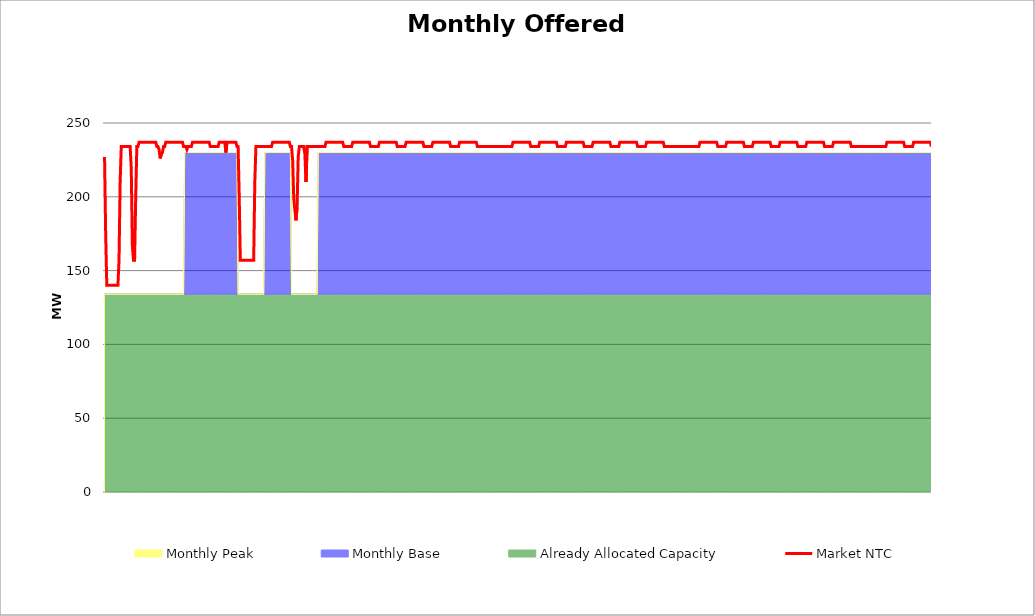
| Category | Market NTC |
|---|---|
| 0 | 227 |
| 1 | 175 |
| 2 | 140 |
| 3 | 140 |
| 4 | 140 |
| 5 | 140 |
| 6 | 140 |
| 7 | 140 |
| 8 | 140 |
| 9 | 140 |
| 10 | 140 |
| 11 | 140 |
| 12 | 140 |
| 13 | 157 |
| 14 | 210 |
| 15 | 234 |
| 16 | 234 |
| 17 | 234 |
| 18 | 234 |
| 19 | 234 |
| 20 | 234 |
| 21 | 234 |
| 22 | 234 |
| 23 | 234 |
| 24 | 219 |
| 25 | 167 |
| 26 | 157 |
| 27 | 157 |
| 28 | 200 |
| 29 | 234 |
| 30 | 234 |
| 31 | 237 |
| 32 | 237 |
| 33 | 237 |
| 34 | 237 |
| 35 | 237 |
| 36 | 237 |
| 37 | 237 |
| 38 | 237 |
| 39 | 237 |
| 40 | 237 |
| 41 | 237 |
| 42 | 237 |
| 43 | 237 |
| 44 | 237 |
| 45 | 237 |
| 46 | 237 |
| 47 | 234 |
| 48 | 234 |
| 49 | 232 |
| 50 | 226 |
| 51 | 229 |
| 52 | 230 |
| 53 | 234 |
| 54 | 234 |
| 55 | 237 |
| 56 | 237 |
| 57 | 237 |
| 58 | 237 |
| 59 | 237 |
| 60 | 237 |
| 61 | 237 |
| 62 | 237 |
| 63 | 237 |
| 64 | 237 |
| 65 | 237 |
| 66 | 237 |
| 67 | 237 |
| 68 | 237 |
| 69 | 237 |
| 70 | 237 |
| 71 | 234 |
| 72 | 234 |
| 73 | 234 |
| 74 | 232 |
| 75 | 234 |
| 76 | 234 |
| 77 | 234 |
| 78 | 234 |
| 79 | 237 |
| 80 | 237 |
| 81 | 237 |
| 82 | 237 |
| 83 | 237 |
| 84 | 237 |
| 85 | 237 |
| 86 | 237 |
| 87 | 237 |
| 88 | 237 |
| 89 | 237 |
| 90 | 237 |
| 91 | 237 |
| 92 | 237 |
| 93 | 237 |
| 94 | 237 |
| 95 | 234 |
| 96 | 234 |
| 97 | 234 |
| 98 | 234 |
| 99 | 234 |
| 100 | 234 |
| 101 | 234 |
| 102 | 234 |
| 103 | 237 |
| 104 | 237 |
| 105 | 237 |
| 106 | 237 |
| 107 | 237 |
| 108 | 237 |
| 109 | 230 |
| 110 | 237 |
| 111 | 237 |
| 112 | 237 |
| 113 | 237 |
| 114 | 237 |
| 115 | 237 |
| 116 | 237 |
| 117 | 237 |
| 118 | 237 |
| 119 | 234 |
| 120 | 234 |
| 121 | 200 |
| 122 | 157 |
| 123 | 157 |
| 124 | 157 |
| 125 | 157 |
| 126 | 157 |
| 127 | 157 |
| 128 | 157 |
| 129 | 157 |
| 130 | 157 |
| 131 | 157 |
| 132 | 157 |
| 133 | 157 |
| 134 | 157 |
| 135 | 210 |
| 136 | 234 |
| 137 | 234 |
| 138 | 234 |
| 139 | 234 |
| 140 | 234 |
| 141 | 234 |
| 142 | 234 |
| 143 | 234 |
| 144 | 234 |
| 145 | 234 |
| 146 | 234 |
| 147 | 234 |
| 148 | 234 |
| 149 | 234 |
| 150 | 234 |
| 151 | 237 |
| 152 | 237 |
| 153 | 237 |
| 154 | 237 |
| 155 | 237 |
| 156 | 237 |
| 157 | 237 |
| 158 | 237 |
| 159 | 237 |
| 160 | 237 |
| 161 | 237 |
| 162 | 237 |
| 163 | 237 |
| 164 | 237 |
| 165 | 237 |
| 166 | 237 |
| 167 | 234 |
| 168 | 234 |
| 169 | 225 |
| 170 | 199 |
| 171 | 191 |
| 172 | 184 |
| 173 | 193 |
| 174 | 227 |
| 175 | 234 |
| 176 | 234 |
| 177 | 234 |
| 178 | 234 |
| 179 | 234 |
| 180 | 229 |
| 181 | 210 |
| 182 | 234 |
| 183 | 234 |
| 184 | 234 |
| 185 | 234 |
| 186 | 234 |
| 187 | 234 |
| 188 | 234 |
| 189 | 234 |
| 190 | 234 |
| 191 | 234 |
| 192 | 234 |
| 193 | 234 |
| 194 | 234 |
| 195 | 234 |
| 196 | 234 |
| 197 | 234 |
| 198 | 234 |
| 199 | 237 |
| 200 | 237 |
| 201 | 237 |
| 202 | 237 |
| 203 | 237 |
| 204 | 237 |
| 205 | 237 |
| 206 | 237 |
| 207 | 237 |
| 208 | 237 |
| 209 | 237 |
| 210 | 237 |
| 211 | 237 |
| 212 | 237 |
| 213 | 237 |
| 214 | 237 |
| 215 | 234 |
| 216 | 234 |
| 217 | 234 |
| 218 | 234 |
| 219 | 234 |
| 220 | 234 |
| 221 | 234 |
| 222 | 234 |
| 223 | 237 |
| 224 | 237 |
| 225 | 237 |
| 226 | 237 |
| 227 | 237 |
| 228 | 237 |
| 229 | 237 |
| 230 | 237 |
| 231 | 237 |
| 232 | 237 |
| 233 | 237 |
| 234 | 237 |
| 235 | 237 |
| 236 | 237 |
| 237 | 237 |
| 238 | 237 |
| 239 | 234 |
| 240 | 234 |
| 241 | 234 |
| 242 | 234 |
| 243 | 234 |
| 244 | 234 |
| 245 | 234 |
| 246 | 234 |
| 247 | 237 |
| 248 | 237 |
| 249 | 237 |
| 250 | 237 |
| 251 | 237 |
| 252 | 237 |
| 253 | 237 |
| 254 | 237 |
| 255 | 237 |
| 256 | 237 |
| 257 | 237 |
| 258 | 237 |
| 259 | 237 |
| 260 | 237 |
| 261 | 237 |
| 262 | 237 |
| 263 | 234 |
| 264 | 234 |
| 265 | 234 |
| 266 | 234 |
| 267 | 234 |
| 268 | 234 |
| 269 | 234 |
| 270 | 234 |
| 271 | 237 |
| 272 | 237 |
| 273 | 237 |
| 274 | 237 |
| 275 | 237 |
| 276 | 237 |
| 277 | 237 |
| 278 | 237 |
| 279 | 237 |
| 280 | 237 |
| 281 | 237 |
| 282 | 237 |
| 283 | 237 |
| 284 | 237 |
| 285 | 237 |
| 286 | 237 |
| 287 | 234 |
| 288 | 234 |
| 289 | 234 |
| 290 | 234 |
| 291 | 234 |
| 292 | 234 |
| 293 | 234 |
| 294 | 234 |
| 295 | 237 |
| 296 | 237 |
| 297 | 237 |
| 298 | 237 |
| 299 | 237 |
| 300 | 237 |
| 301 | 237 |
| 302 | 237 |
| 303 | 237 |
| 304 | 237 |
| 305 | 237 |
| 306 | 237 |
| 307 | 237 |
| 308 | 237 |
| 309 | 237 |
| 310 | 237 |
| 311 | 234 |
| 312 | 234 |
| 313 | 234 |
| 314 | 234 |
| 315 | 234 |
| 316 | 234 |
| 317 | 234 |
| 318 | 234 |
| 319 | 237 |
| 320 | 237 |
| 321 | 237 |
| 322 | 237 |
| 323 | 237 |
| 324 | 237 |
| 325 | 237 |
| 326 | 237 |
| 327 | 237 |
| 328 | 237 |
| 329 | 237 |
| 330 | 237 |
| 331 | 237 |
| 332 | 237 |
| 333 | 237 |
| 334 | 237 |
| 335 | 234 |
| 336 | 234 |
| 337 | 234 |
| 338 | 234 |
| 339 | 234 |
| 340 | 234 |
| 341 | 234 |
| 342 | 234 |
| 343 | 234 |
| 344 | 234 |
| 345 | 234 |
| 346 | 234 |
| 347 | 234 |
| 348 | 234 |
| 349 | 234 |
| 350 | 234 |
| 351 | 234 |
| 352 | 234 |
| 353 | 234 |
| 354 | 234 |
| 355 | 234 |
| 356 | 234 |
| 357 | 234 |
| 358 | 234 |
| 359 | 234 |
| 360 | 234 |
| 361 | 234 |
| 362 | 234 |
| 363 | 234 |
| 364 | 234 |
| 365 | 234 |
| 366 | 234 |
| 367 | 237 |
| 368 | 237 |
| 369 | 237 |
| 370 | 237 |
| 371 | 237 |
| 372 | 237 |
| 373 | 237 |
| 374 | 237 |
| 375 | 237 |
| 376 | 237 |
| 377 | 237 |
| 378 | 237 |
| 379 | 237 |
| 380 | 237 |
| 381 | 237 |
| 382 | 237 |
| 383 | 234 |
| 384 | 234 |
| 385 | 234 |
| 386 | 234 |
| 387 | 234 |
| 388 | 234 |
| 389 | 234 |
| 390 | 234 |
| 391 | 237 |
| 392 | 237 |
| 393 | 237 |
| 394 | 237 |
| 395 | 237 |
| 396 | 237 |
| 397 | 237 |
| 398 | 237 |
| 399 | 237 |
| 400 | 237 |
| 401 | 237 |
| 402 | 237 |
| 403 | 237 |
| 404 | 237 |
| 405 | 237 |
| 406 | 237 |
| 407 | 234 |
| 408 | 234 |
| 409 | 234 |
| 410 | 234 |
| 411 | 234 |
| 412 | 234 |
| 413 | 234 |
| 414 | 234 |
| 415 | 237 |
| 416 | 237 |
| 417 | 237 |
| 418 | 237 |
| 419 | 237 |
| 420 | 237 |
| 421 | 237 |
| 422 | 237 |
| 423 | 237 |
| 424 | 237 |
| 425 | 237 |
| 426 | 237 |
| 427 | 237 |
| 428 | 237 |
| 429 | 237 |
| 430 | 237 |
| 431 | 234 |
| 432 | 234 |
| 433 | 234 |
| 434 | 234 |
| 435 | 234 |
| 436 | 234 |
| 437 | 234 |
| 438 | 234 |
| 439 | 237 |
| 440 | 237 |
| 441 | 237 |
| 442 | 237 |
| 443 | 237 |
| 444 | 237 |
| 445 | 237 |
| 446 | 237 |
| 447 | 237 |
| 448 | 237 |
| 449 | 237 |
| 450 | 237 |
| 451 | 237 |
| 452 | 237 |
| 453 | 237 |
| 454 | 237 |
| 455 | 234 |
| 456 | 234 |
| 457 | 234 |
| 458 | 234 |
| 459 | 234 |
| 460 | 234 |
| 461 | 234 |
| 462 | 234 |
| 463 | 237 |
| 464 | 237 |
| 465 | 237 |
| 466 | 237 |
| 467 | 237 |
| 468 | 237 |
| 469 | 237 |
| 470 | 237 |
| 471 | 237 |
| 472 | 237 |
| 473 | 237 |
| 474 | 237 |
| 475 | 237 |
| 476 | 237 |
| 477 | 237 |
| 478 | 237 |
| 479 | 234 |
| 480 | 234 |
| 481 | 234 |
| 482 | 234 |
| 483 | 234 |
| 484 | 234 |
| 485 | 234 |
| 486 | 234 |
| 487 | 237 |
| 488 | 237 |
| 489 | 237 |
| 490 | 237 |
| 491 | 237 |
| 492 | 237 |
| 493 | 237 |
| 494 | 237 |
| 495 | 237 |
| 496 | 237 |
| 497 | 237 |
| 498 | 237 |
| 499 | 237 |
| 500 | 237 |
| 501 | 237 |
| 502 | 237 |
| 503 | 234 |
| 504 | 234 |
| 505 | 234 |
| 506 | 234 |
| 507 | 234 |
| 508 | 234 |
| 509 | 234 |
| 510 | 234 |
| 511 | 234 |
| 512 | 234 |
| 513 | 234 |
| 514 | 234 |
| 515 | 234 |
| 516 | 234 |
| 517 | 234 |
| 518 | 234 |
| 519 | 234 |
| 520 | 234 |
| 521 | 234 |
| 522 | 234 |
| 523 | 234 |
| 524 | 234 |
| 525 | 234 |
| 526 | 234 |
| 527 | 234 |
| 528 | 234 |
| 529 | 234 |
| 530 | 234 |
| 531 | 234 |
| 532 | 234 |
| 533 | 234 |
| 534 | 234 |
| 535 | 237 |
| 536 | 237 |
| 537 | 237 |
| 538 | 237 |
| 539 | 237 |
| 540 | 237 |
| 541 | 237 |
| 542 | 237 |
| 543 | 237 |
| 544 | 237 |
| 545 | 237 |
| 546 | 237 |
| 547 | 237 |
| 548 | 237 |
| 549 | 237 |
| 550 | 237 |
| 551 | 234 |
| 552 | 234 |
| 553 | 234 |
| 554 | 234 |
| 555 | 234 |
| 556 | 234 |
| 557 | 234 |
| 558 | 234 |
| 559 | 237 |
| 560 | 237 |
| 561 | 237 |
| 562 | 237 |
| 563 | 237 |
| 564 | 237 |
| 565 | 237 |
| 566 | 237 |
| 567 | 237 |
| 568 | 237 |
| 569 | 237 |
| 570 | 237 |
| 571 | 237 |
| 572 | 237 |
| 573 | 237 |
| 574 | 237 |
| 575 | 234 |
| 576 | 234 |
| 577 | 234 |
| 578 | 234 |
| 579 | 234 |
| 580 | 234 |
| 581 | 234 |
| 582 | 234 |
| 583 | 237 |
| 584 | 237 |
| 585 | 237 |
| 586 | 237 |
| 587 | 237 |
| 588 | 237 |
| 589 | 237 |
| 590 | 237 |
| 591 | 237 |
| 592 | 237 |
| 593 | 237 |
| 594 | 237 |
| 595 | 237 |
| 596 | 237 |
| 597 | 237 |
| 598 | 237 |
| 599 | 234 |
| 600 | 234 |
| 601 | 234 |
| 602 | 234 |
| 603 | 234 |
| 604 | 234 |
| 605 | 234 |
| 606 | 234 |
| 607 | 237 |
| 608 | 237 |
| 609 | 237 |
| 610 | 237 |
| 611 | 237 |
| 612 | 237 |
| 613 | 237 |
| 614 | 237 |
| 615 | 237 |
| 616 | 237 |
| 617 | 237 |
| 618 | 237 |
| 619 | 237 |
| 620 | 237 |
| 621 | 237 |
| 622 | 237 |
| 623 | 234 |
| 624 | 234 |
| 625 | 234 |
| 626 | 234 |
| 627 | 234 |
| 628 | 234 |
| 629 | 234 |
| 630 | 234 |
| 631 | 237 |
| 632 | 237 |
| 633 | 237 |
| 634 | 237 |
| 635 | 237 |
| 636 | 237 |
| 637 | 237 |
| 638 | 237 |
| 639 | 237 |
| 640 | 237 |
| 641 | 237 |
| 642 | 237 |
| 643 | 237 |
| 644 | 237 |
| 645 | 237 |
| 646 | 237 |
| 647 | 234 |
| 648 | 234 |
| 649 | 234 |
| 650 | 234 |
| 651 | 234 |
| 652 | 234 |
| 653 | 234 |
| 654 | 234 |
| 655 | 237 |
| 656 | 237 |
| 657 | 237 |
| 658 | 237 |
| 659 | 237 |
| 660 | 237 |
| 661 | 237 |
| 662 | 237 |
| 663 | 237 |
| 664 | 237 |
| 665 | 237 |
| 666 | 237 |
| 667 | 237 |
| 668 | 237 |
| 669 | 237 |
| 670 | 237 |
| 671 | 234 |
| 672 | 234 |
| 673 | 234 |
| 674 | 234 |
| 675 | 234 |
| 676 | 234 |
| 677 | 234 |
| 678 | 234 |
| 679 | 234 |
| 680 | 234 |
| 681 | 234 |
| 682 | 234 |
| 683 | 234 |
| 684 | 234 |
| 685 | 234 |
| 686 | 234 |
| 687 | 234 |
| 688 | 234 |
| 689 | 234 |
| 690 | 234 |
| 691 | 234 |
| 692 | 234 |
| 693 | 234 |
| 694 | 234 |
| 695 | 234 |
| 696 | 234 |
| 697 | 234 |
| 698 | 234 |
| 699 | 234 |
| 700 | 234 |
| 701 | 234 |
| 702 | 234 |
| 703 | 237 |
| 704 | 237 |
| 705 | 237 |
| 706 | 237 |
| 707 | 237 |
| 708 | 237 |
| 709 | 237 |
| 710 | 237 |
| 711 | 237 |
| 712 | 237 |
| 713 | 237 |
| 714 | 237 |
| 715 | 237 |
| 716 | 237 |
| 717 | 237 |
| 718 | 237 |
| 719 | 234 |
| 720 | 234 |
| 721 | 234 |
| 722 | 234 |
| 723 | 234 |
| 724 | 234 |
| 725 | 234 |
| 726 | 234 |
| 727 | 237 |
| 728 | 237 |
| 729 | 237 |
| 730 | 237 |
| 731 | 237 |
| 732 | 237 |
| 733 | 237 |
| 734 | 237 |
| 735 | 237 |
| 736 | 237 |
| 737 | 237 |
| 738 | 237 |
| 739 | 237 |
| 740 | 237 |
| 741 | 237 |
| 742 | 237 |
| 743 | 234 |